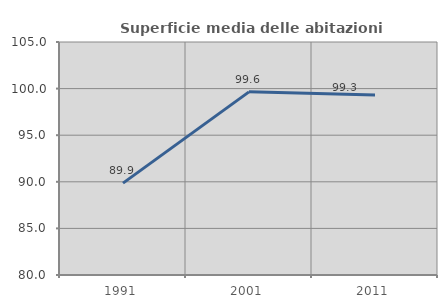
| Category | Superficie media delle abitazioni occupate |
|---|---|
| 1991.0 | 89.856 |
| 2001.0 | 99.649 |
| 2011.0 | 99.312 |